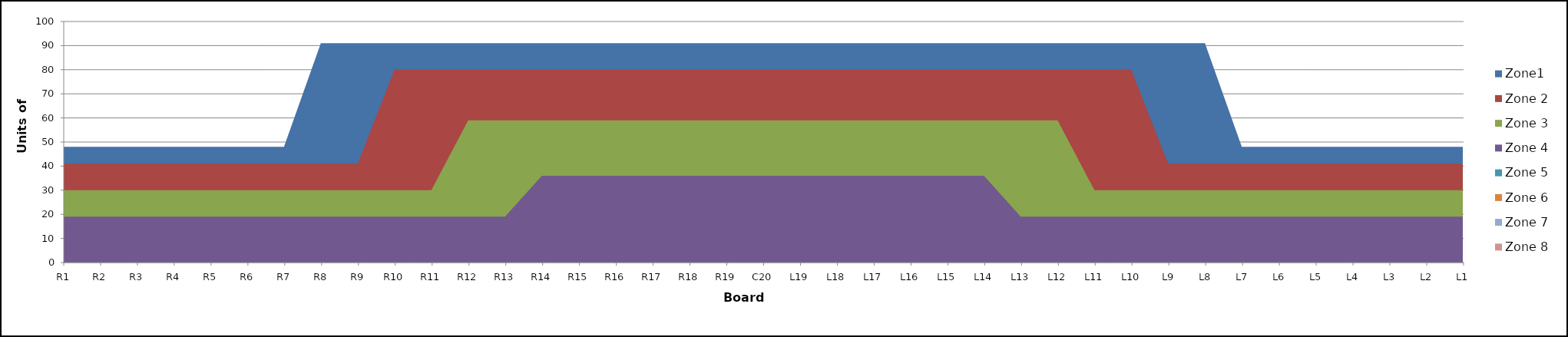
| Category | Zone1 | Zone 2 | Zone 3 | Zone 4 | Zone 5 | Zone 6 | Zone 7 | Zone 8 |
|---|---|---|---|---|---|---|---|---|
| L1 | 48 | 41 | 30 | 19 | 0 |  |  |  |
| L2 | 48 | 41 | 30 | 19 | 0 |  |  |  |
| L3 | 48 | 41 | 30 | 19 | 0 |  |  |  |
| L4 | 48 | 41 | 30 | 19 | 0 |  |  |  |
| L5 | 48 | 41 | 30 | 19 | 0 |  |  |  |
| L6 | 48 | 41 | 30 | 19 | 0 |  |  |  |
| L7 | 48 | 41 | 30 | 19 | 0 |  |  |  |
| L8 | 91 | 41 | 30 | 19 | 0 |  |  |  |
| L9 | 91 | 41 | 30 | 19 | 0 |  |  |  |
| L10 | 91 | 80 | 30 | 19 | 0 |  |  |  |
| L11 | 91 | 80 | 30 | 19 | 0 |  |  |  |
| L12 | 91 | 80 | 59 | 19 | 0 |  |  |  |
| L13 | 91 | 80 | 59 | 19 | 0 |  |  |  |
| L14 | 91 | 80 | 59 | 36 | 0 |  |  |  |
| L15 | 91 | 80 | 59 | 36 | 0 |  |  |  |
| L16 | 91 | 80 | 59 | 36 | 0 |  |  |  |
| L17 | 91 | 80 | 59 | 36 | 0 |  |  |  |
| L18 | 91 | 80 | 59 | 36 | 0 |  |  |  |
| L19 | 91 | 80 | 59 | 36 | 0 |  |  |  |
| C20 | 91 | 80 | 59 | 36 | 0 |  |  |  |
| R19 | 91 | 80 | 59 | 36 | 0 |  |  |  |
| R18 | 91 | 80 | 59 | 36 | 0 |  |  |  |
| R17 | 91 | 80 | 59 | 36 | 0 |  |  |  |
| R16 | 91 | 80 | 59 | 36 | 0 |  |  |  |
| R15 | 91 | 80 | 59 | 36 | 0 |  |  |  |
| R14 | 91 | 80 | 59 | 36 | 0 |  |  |  |
| R13 | 91 | 80 | 59 | 19 | 0 |  |  |  |
| R12 | 91 | 80 | 59 | 19 | 0 |  |  |  |
| R11 | 91 | 80 | 30 | 19 | 0 |  |  |  |
| R10 | 91 | 80 | 30 | 19 | 0 |  |  |  |
| R9 | 91 | 41 | 30 | 19 | 0 |  |  |  |
| R8 | 91 | 41 | 30 | 19 | 0 |  |  |  |
| R7 | 48 | 41 | 30 | 19 | 0 |  |  |  |
| R6 | 48 | 41 | 30 | 19 | 0 |  |  |  |
| R5 | 48 | 41 | 30 | 19 | 0 |  |  |  |
| R4 | 48 | 41 | 30 | 19 | 0 |  |  |  |
| R3 | 48 | 41 | 30 | 19 | 0 |  |  |  |
| R2 | 48 | 41 | 30 | 19 | 0 |  |  |  |
| R1 | 48 | 41 | 30 | 19 | 0 |  |  |  |